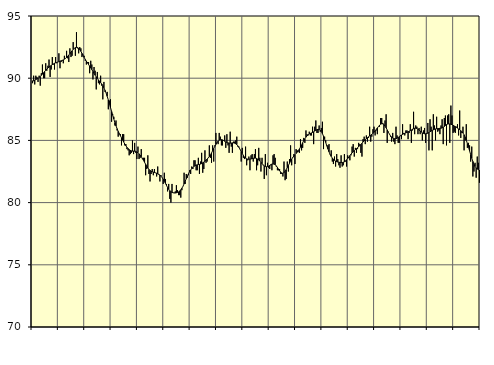
| Category | Piggar | Series 1 |
|---|---|---|
| nan | 89.6 | 89.79 |
| 87.0 | 90.2 | 89.79 |
| 87.0 | 89.5 | 89.84 |
| 87.0 | 90.2 | 89.89 |
| 87.0 | 90.1 | 89.94 |
| 87.0 | 89.7 | 90 |
| 87.0 | 90.2 | 90.06 |
| 87.0 | 89.4 | 90.14 |
| 87.0 | 90.4 | 90.23 |
| 87.0 | 91.1 | 90.33 |
| 87.0 | 90 | 90.43 |
| 87.0 | 90 | 90.54 |
| nan | 91.2 | 90.64 |
| 88.0 | 90.6 | 90.73 |
| 88.0 | 91 | 90.82 |
| 88.0 | 91.5 | 90.89 |
| 88.0 | 90.1 | 90.96 |
| 88.0 | 90.7 | 91.03 |
| 88.0 | 91.7 | 91.09 |
| 88.0 | 91.1 | 91.15 |
| 88.0 | 90.7 | 91.2 |
| 88.0 | 91.7 | 91.24 |
| 88.0 | 91.2 | 91.27 |
| 88.0 | 91.3 | 91.3 |
| nan | 92 | 91.33 |
| 89.0 | 90.8 | 91.37 |
| 89.0 | 91.3 | 91.4 |
| 89.0 | 91.4 | 91.43 |
| 89.0 | 91.2 | 91.47 |
| 89.0 | 91.8 | 91.53 |
| 89.0 | 91.6 | 91.59 |
| 89.0 | 92.2 | 91.67 |
| 89.0 | 91.6 | 91.76 |
| 89.0 | 91.3 | 91.86 |
| 89.0 | 92.4 | 91.97 |
| 89.0 | 91.7 | 92.09 |
| nan | 91.8 | 92.2 |
| 90.0 | 92.9 | 92.31 |
| 90.0 | 92.4 | 92.4 |
| 90.0 | 91.8 | 92.46 |
| 90.0 | 93.7 | 92.48 |
| 90.0 | 92.4 | 92.47 |
| 90.0 | 92 | 92.4 |
| 90.0 | 92.5 | 92.3 |
| 90.0 | 92.4 | 92.16 |
| 90.0 | 91.7 | 92 |
| 90.0 | 91.9 | 91.83 |
| 90.0 | 91.8 | 91.67 |
| nan | 91.4 | 91.51 |
| 91.0 | 91.1 | 91.37 |
| 91.0 | 91.3 | 91.23 |
| 91.0 | 91.3 | 91.1 |
| 91.0 | 90.4 | 90.97 |
| 91.0 | 91.4 | 90.83 |
| 91.0 | 91.1 | 90.69 |
| 91.0 | 89.9 | 90.54 |
| 91.0 | 90.9 | 90.39 |
| 91.0 | 90.6 | 90.24 |
| 91.0 | 89.1 | 90.11 |
| 91.0 | 90.5 | 89.98 |
| nan | 89.6 | 89.86 |
| 92.0 | 89.5 | 89.76 |
| 92.0 | 90.2 | 89.65 |
| 92.0 | 89.4 | 89.53 |
| 92.0 | 88.3 | 89.4 |
| 92.0 | 89.7 | 89.23 |
| 92.0 | 88.9 | 89.03 |
| 92.0 | 88.8 | 88.8 |
| 92.0 | 88.9 | 88.54 |
| 92.0 | 87.5 | 88.25 |
| 92.0 | 88.2 | 87.95 |
| 92.0 | 88.3 | 87.64 |
| nan | 86.5 | 87.33 |
| 93.0 | 87.1 | 87.02 |
| 93.0 | 86.9 | 86.72 |
| 93.0 | 86.2 | 86.43 |
| 93.0 | 86.6 | 86.17 |
| 93.0 | 85.8 | 85.94 |
| 93.0 | 85.3 | 85.73 |
| 93.0 | 85.5 | 85.55 |
| 93.0 | 85.5 | 85.38 |
| 93.0 | 84.6 | 85.21 |
| 93.0 | 85.5 | 85.04 |
| 93.0 | 85.5 | 84.87 |
| nan | 84.6 | 84.71 |
| 94.0 | 84.7 | 84.57 |
| 94.0 | 84.3 | 84.44 |
| 94.0 | 84.2 | 84.34 |
| 94.0 | 83.8 | 84.26 |
| 94.0 | 83.9 | 84.2 |
| 94.0 | 84 | 84.16 |
| 94.0 | 85 | 84.14 |
| 94.0 | 83.9 | 84.14 |
| 94.0 | 84.8 | 84.13 |
| 94.0 | 84 | 84.12 |
| 94.0 | 83.5 | 84.07 |
| nan | 84.5 | 84.01 |
| 95.0 | 83.5 | 83.92 |
| 95.0 | 83.6 | 83.81 |
| 95.0 | 84.3 | 83.69 |
| 95.0 | 83.5 | 83.55 |
| 95.0 | 83.6 | 83.4 |
| 95.0 | 83.6 | 83.24 |
| 95.0 | 82.2 | 83.08 |
| 95.0 | 82.7 | 82.93 |
| 95.0 | 83.8 | 82.79 |
| 95.0 | 82.3 | 82.67 |
| 95.0 | 81.7 | 82.58 |
| nan | 82.3 | 82.52 |
| 96.0 | 82.7 | 82.48 |
| 96.0 | 82.2 | 82.45 |
| 96.0 | 82.7 | 82.42 |
| 96.0 | 82.4 | 82.39 |
| 96.0 | 82.1 | 82.36 |
| 96.0 | 82.9 | 82.31 |
| 96.0 | 82.3 | 82.27 |
| 96.0 | 81.7 | 82.21 |
| 96.0 | 82.2 | 82.12 |
| 96.0 | 82 | 82.01 |
| 96.0 | 81.5 | 81.88 |
| nan | 82.4 | 81.72 |
| 97.0 | 81.9 | 81.55 |
| 97.0 | 81.5 | 81.38 |
| 97.0 | 80.9 | 81.21 |
| 97.0 | 81.5 | 81.07 |
| 97.0 | 80.3 | 80.96 |
| 97.0 | 80 | 80.88 |
| 97.0 | 81.5 | 80.82 |
| 97.0 | 80.8 | 80.79 |
| 97.0 | 80.8 | 80.77 |
| 97.0 | 80.9 | 80.77 |
| 97.0 | 81.4 | 80.79 |
| nan | 81 | 80.82 |
| 98.0 | 80.6 | 80.86 |
| 98.0 | 80.6 | 80.93 |
| 98.0 | 80.4 | 81.03 |
| 98.0 | 81 | 81.16 |
| 98.0 | 81.3 | 81.31 |
| 98.0 | 82.4 | 81.5 |
| 98.0 | 81.5 | 81.71 |
| 98.0 | 82.3 | 81.92 |
| 98.0 | 82 | 82.13 |
| 98.0 | 82.2 | 82.32 |
| 98.0 | 82.6 | 82.49 |
| nan | 82.3 | 82.62 |
| 99.0 | 82.9 | 82.74 |
| 99.0 | 82.7 | 82.83 |
| 99.0 | 83.4 | 82.91 |
| 99.0 | 83.4 | 82.97 |
| 99.0 | 82.6 | 83.02 |
| 99.0 | 82.6 | 83.04 |
| 99.0 | 83.6 | 83.06 |
| 99.0 | 82.3 | 83.07 |
| 99.0 | 83.3 | 83.1 |
| 99.0 | 84 | 83.14 |
| 99.0 | 82.4 | 83.2 |
| nan | 82.7 | 83.26 |
| 0.0 | 84.2 | 83.34 |
| 0.0 | 83.2 | 83.41 |
| 0.0 | 83.3 | 83.5 |
| 0.0 | 83.6 | 83.59 |
| 0.0 | 84.6 | 83.7 |
| 0.0 | 83.6 | 83.83 |
| 0.0 | 83.2 | 83.99 |
| 0.0 | 84.6 | 84.17 |
| 0.0 | 83.3 | 84.35 |
| 0.0 | 84.6 | 84.52 |
| 0.0 | 85.6 | 84.68 |
| nan | 84.8 | 84.83 |
| 1.0 | 84.7 | 84.94 |
| 1.0 | 85.6 | 85.02 |
| 1.0 | 85.3 | 85.06 |
| 1.0 | 84.6 | 85.06 |
| 1.0 | 84.6 | 85.04 |
| 1.0 | 85 | 84.99 |
| 1.0 | 85.4 | 84.93 |
| 1.0 | 84.4 | 84.88 |
| 1.0 | 85.5 | 84.83 |
| 1.0 | 84.6 | 84.8 |
| 1.0 | 84 | 84.78 |
| nan | 85.7 | 84.78 |
| 2.0 | 84.5 | 84.79 |
| 2.0 | 84 | 84.8 |
| 2.0 | 84.9 | 84.8 |
| 2.0 | 84.9 | 84.78 |
| 2.0 | 85 | 84.73 |
| 2.0 | 85.3 | 84.66 |
| 2.0 | 84.5 | 84.56 |
| 2.0 | 84.5 | 84.43 |
| 2.0 | 84.3 | 84.28 |
| 2.0 | 83.3 | 84.11 |
| 2.0 | 84.4 | 83.95 |
| nan | 83.6 | 83.79 |
| 3.0 | 83.5 | 83.66 |
| 3.0 | 84.5 | 83.57 |
| 3.0 | 83 | 83.52 |
| 3.0 | 83.4 | 83.49 |
| 3.0 | 83.7 | 83.49 |
| 3.0 | 82.6 | 83.5 |
| 3.0 | 83.8 | 83.51 |
| 3.0 | 83.9 | 83.53 |
| 3.0 | 83.3 | 83.56 |
| 3.0 | 83.9 | 83.57 |
| 3.0 | 84.3 | 83.58 |
| nan | 82.6 | 83.55 |
| 4.0 | 83 | 83.5 |
| 4.0 | 84.4 | 83.43 |
| 4.0 | 83.6 | 83.34 |
| 4.0 | 82.5 | 83.24 |
| 4.0 | 83.6 | 83.13 |
| 4.0 | 83 | 83.03 |
| 4.0 | 81.9 | 82.95 |
| 4.0 | 83.9 | 82.9 |
| 4.0 | 82.2 | 82.88 |
| 4.0 | 83.2 | 82.9 |
| 4.0 | 82.8 | 82.93 |
| nan | 82.7 | 82.99 |
| 5.0 | 83 | 83.05 |
| 5.0 | 82.6 | 83.1 |
| 5.0 | 83.8 | 83.11 |
| 5.0 | 83.9 | 83.09 |
| 5.0 | 83.6 | 83.04 |
| 5.0 | 82.9 | 82.95 |
| 5.0 | 82.6 | 82.83 |
| 5.0 | 82.6 | 82.69 |
| 5.0 | 82.7 | 82.56 |
| 5.0 | 82.3 | 82.45 |
| 5.0 | 82.3 | 82.37 |
| nan | 82.1 | 82.36 |
| 6.0 | 83.3 | 82.41 |
| 6.0 | 81.8 | 82.51 |
| 6.0 | 81.9 | 82.65 |
| 6.0 | 83.3 | 82.82 |
| 6.0 | 82.5 | 82.99 |
| 6.0 | 83.5 | 83.16 |
| 6.0 | 84.6 | 83.34 |
| 6.0 | 83 | 83.49 |
| 6.0 | 83.6 | 83.63 |
| 6.0 | 83.9 | 83.75 |
| 6.0 | 83.1 | 83.85 |
| nan | 84.3 | 83.95 |
| 7.0 | 84.2 | 84.05 |
| 7.0 | 84.1 | 84.17 |
| 7.0 | 84 | 84.3 |
| 7.0 | 85.1 | 84.46 |
| 7.0 | 84.2 | 84.63 |
| 7.0 | 84.4 | 84.81 |
| 7.0 | 85.2 | 84.98 |
| 7.0 | 84.8 | 85.13 |
| 7.0 | 85.8 | 85.26 |
| 7.0 | 85.5 | 85.36 |
| 7.0 | 85.4 | 85.45 |
| nan | 85.7 | 85.52 |
| 8.0 | 85.4 | 85.56 |
| 8.0 | 85.4 | 85.6 |
| 8.0 | 86.1 | 85.64 |
| 8.0 | 84.7 | 85.69 |
| 8.0 | 86.1 | 85.75 |
| 8.0 | 86.6 | 85.81 |
| 8.0 | 85.6 | 85.86 |
| 8.0 | 85.6 | 85.89 |
| 8.0 | 86.2 | 85.88 |
| 8.0 | 85.7 | 85.82 |
| 8.0 | 86 | 85.71 |
| nan | 86.5 | 85.54 |
| 9.0 | 84.3 | 85.34 |
| 9.0 | 85.3 | 85.09 |
| 9.0 | 85 | 84.83 |
| 9.0 | 84.6 | 84.56 |
| 9.0 | 84.6 | 84.31 |
| 9.0 | 84.7 | 84.08 |
| 9.0 | 83.9 | 83.87 |
| 9.0 | 84.2 | 83.71 |
| 9.0 | 83.3 | 83.58 |
| 9.0 | 83.1 | 83.48 |
| 9.0 | 83.7 | 83.4 |
| nan | 82.9 | 83.34 |
| 10.0 | 83.9 | 83.29 |
| 10.0 | 83.5 | 83.26 |
| 10.0 | 83 | 83.24 |
| 10.0 | 82.8 | 83.23 |
| 10.0 | 83.8 | 83.22 |
| 10.0 | 82.9 | 83.22 |
| 10.0 | 83 | 83.24 |
| 10.0 | 83.9 | 83.28 |
| 10.0 | 83.3 | 83.35 |
| 10.0 | 82.9 | 83.44 |
| 10.0 | 83.8 | 83.54 |
| nan | 83.6 | 83.66 |
| 11.0 | 83.4 | 83.78 |
| 11.0 | 83.8 | 83.89 |
| 11.0 | 84.5 | 84 |
| 11.0 | 84.7 | 84.09 |
| 11.0 | 83.7 | 84.18 |
| 11.0 | 84.4 | 84.26 |
| 11.0 | 84 | 84.34 |
| 11.0 | 84.3 | 84.41 |
| 11.0 | 84.8 | 84.49 |
| 11.0 | 84.7 | 84.58 |
| 11.0 | 84 | 84.67 |
| nan | 83.7 | 84.77 |
| 12.0 | 85.1 | 84.87 |
| 12.0 | 85.3 | 84.97 |
| 12.0 | 84.7 | 85.06 |
| 12.0 | 85.4 | 85.14 |
| 12.0 | 84.9 | 85.22 |
| 12.0 | 85.2 | 85.29 |
| 12.0 | 86.1 | 85.36 |
| 12.0 | 84.9 | 85.42 |
| 12.0 | 85.3 | 85.49 |
| 12.0 | 85.9 | 85.57 |
| 12.0 | 86.1 | 85.65 |
| nan | 85.4 | 85.76 |
| 13.0 | 85.8 | 85.87 |
| 13.0 | 85.5 | 86 |
| 13.0 | 86.1 | 86.11 |
| 13.0 | 86.1 | 86.22 |
| 13.0 | 86.8 | 86.3 |
| 13.0 | 86.8 | 86.34 |
| 13.0 | 86.4 | 86.33 |
| 13.0 | 85.6 | 86.27 |
| 13.0 | 86.6 | 86.15 |
| 13.0 | 87.1 | 86.01 |
| 13.0 | 84.8 | 85.84 |
| nan | 85.7 | 85.66 |
| 14.0 | 85.5 | 85.51 |
| 14.0 | 85.3 | 85.37 |
| 14.0 | 84.9 | 85.27 |
| 14.0 | 85.6 | 85.19 |
| 14.0 | 84.9 | 85.15 |
| 14.0 | 84.7 | 85.13 |
| 14.0 | 86.1 | 85.14 |
| 14.0 | 85.4 | 85.18 |
| 14.0 | 84.8 | 85.23 |
| 14.0 | 84.8 | 85.3 |
| 14.0 | 85.4 | 85.36 |
| nan | 85.1 | 85.43 |
| 15.0 | 86.3 | 85.48 |
| 15.0 | 85.6 | 85.53 |
| 15.0 | 85.4 | 85.57 |
| 15.0 | 85.8 | 85.61 |
| 15.0 | 85.8 | 85.64 |
| 15.0 | 85.1 | 85.69 |
| 15.0 | 85.6 | 85.74 |
| 15.0 | 86.3 | 85.78 |
| 15.0 | 84.8 | 85.84 |
| 15.0 | 85.8 | 85.9 |
| 15.0 | 87.3 | 85.94 |
| nan | 85.5 | 85.98 |
| 16.0 | 86.2 | 85.98 |
| 16.0 | 86.1 | 85.95 |
| 16.0 | 85.5 | 85.9 |
| 16.0 | 86 | 85.83 |
| 16.0 | 85.5 | 85.75 |
| 16.0 | 86.1 | 85.67 |
| 16.0 | 85 | 85.6 |
| 16.0 | 85.8 | 85.56 |
| 16.0 | 86 | 85.53 |
| 16.0 | 84.8 | 85.53 |
| 16.0 | 85.6 | 85.55 |
| nan | 86.4 | 85.58 |
| 17.0 | 84.2 | 85.63 |
| 17.0 | 86.7 | 85.69 |
| 17.0 | 86.1 | 85.75 |
| 17.0 | 84.2 | 85.81 |
| 17.0 | 87.1 | 85.85 |
| 17.0 | 86.2 | 85.89 |
| 17.0 | 85 | 85.92 |
| 17.0 | 86.9 | 85.94 |
| 17.0 | 85.7 | 85.95 |
| 17.0 | 85.8 | 85.96 |
| 17.0 | 85.5 | 85.97 |
| nan | 86.2 | 85.98 |
| 18.0 | 86.7 | 86.01 |
| 18.0 | 84.7 | 86.06 |
| 18.0 | 86.8 | 86.12 |
| 18.0 | 87 | 86.2 |
| 18.0 | 84.6 | 86.27 |
| 18.0 | 87 | 86.31 |
| 18.0 | 87.1 | 86.33 |
| 18.0 | 84.8 | 86.32 |
| 18.0 | 87.8 | 86.3 |
| 18.0 | 87 | 86.26 |
| 18.0 | 85.6 | 86.22 |
| nan | 85.7 | 86.16 |
| 19.0 | 85.6 | 86.11 |
| 19.0 | 86.1 | 86.05 |
| 19.0 | 86.3 | 85.99 |
| 19.0 | 85.4 | 85.92 |
| 19.0 | 87.4 | 85.86 |
| 19.0 | 85.2 | 85.79 |
| 19.0 | 85.6 | 85.7 |
| 19.0 | 86.1 | 85.59 |
| 19.0 | 84.2 | 85.45 |
| 19.0 | 85 | 85.26 |
| 19.0 | 86.3 | 85.02 |
| nan | 84.4 | 84.75 |
| 20.0 | 84.8 | 84.46 |
| 20.0 | 84.6 | 84.16 |
| 20.0 | 83.3 | 83.86 |
| 20.0 | 84.5 | 83.57 |
| 20.0 | 82.1 | 83.31 |
| 20.0 | 82.5 | 83.08 |
| 20.0 | 83.2 | 82.91 |
| 20.0 | 82 | 82.78 |
| 20.0 | 83.7 | 82.7 |
| 20.0 | 83.2 | 82.65 |
| 20.0 | 81.6 | 82.61 |